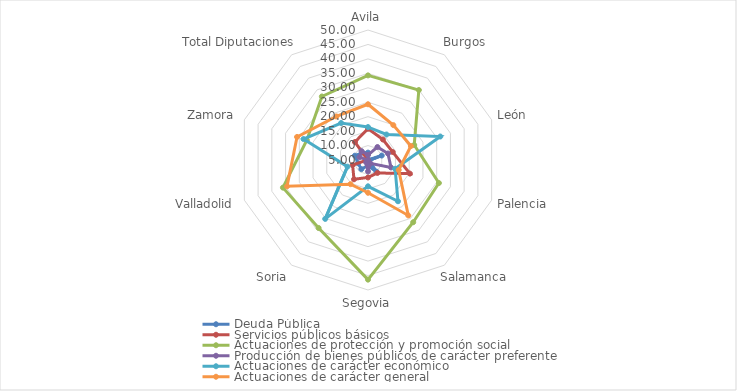
| Category | Deuda Pública | Servicios públicos básicos | Actuaciones de protección y promoción social | Producción de bienes públicos de carácter preferente | Actuaciones de carácter económico | Actuaciones de carácter general |
|---|---|---|---|---|---|---|
| Avila | 2.445 | 15.845 | 34.289 | 6.733 | 16.397 | 24.291 |
| Burgos | 4.901 | 13.772 | 34.941 | 10.555 | 15.91 | 19.921 |
| León | 0 | 13.978 | 21.819 | 12.268 | 31.309 | 20.625 |
| Palencia | 4.543 | 20.249 | 30.801 | 13.36 | 14.872 | 16.175 |
| Salamanca | 0 | 10.547 | 31.622 | 6.467 | 22.645 | 28.72 |
| Segovia | 3.132 | 11.041 | 46.417 | 8.963 | 14.105 | 16.343 |
| Soria | 1.078 | 13.249 | 34.083 | 6.057 | 30.203 | 15.33 |
| Valladolid | 1.378 | 10.61 | 35.961 | 5.12 | 12.469 | 34.462 |
| Zamora | 0.201 | 5.139 | 27.272 | 8.089 | 28.471 | 30.828 |
| Total Diputaciones | 1.85 | 12.693 | 32.175 | 8.817 | 20.83 | 23.634 |